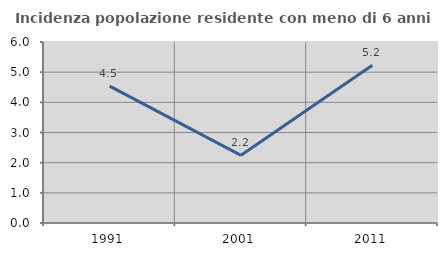
| Category | Incidenza popolazione residente con meno di 6 anni |
|---|---|
| 1991.0 | 4.536 |
| 2001.0 | 2.244 |
| 2011.0 | 5.231 |